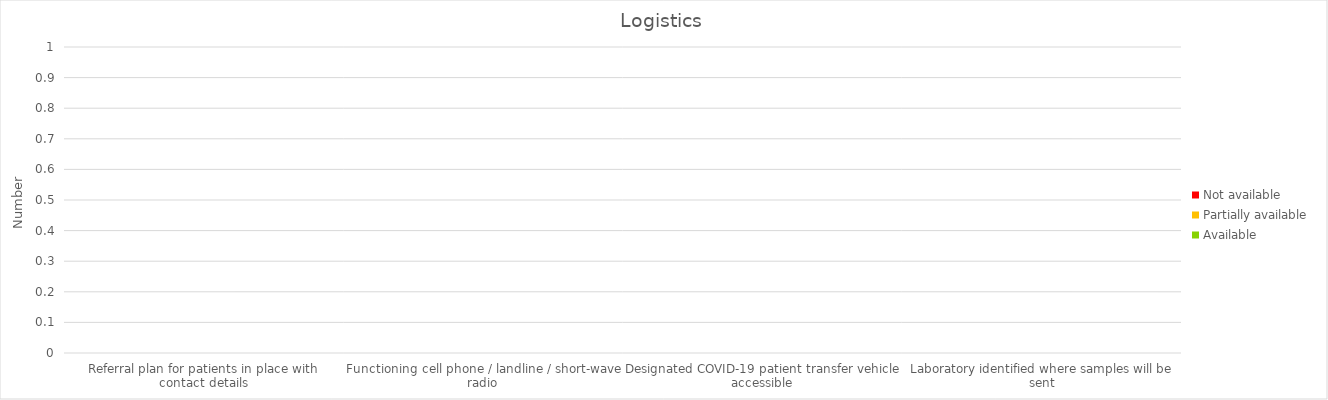
| Category | Available | Partially available | Not available |
|---|---|---|---|
| Referral plan for patients in place with contact details | 0 | 0 | 0 |
| Functioning cell phone / landline / short-wave radio | 0 | 0 | 0 |
| Designated COVID-19 patient transfer vehicle accessible | 0 | 0 | 0 |
| Laboratory identified where samples will be sent | 0 | 0 | 0 |